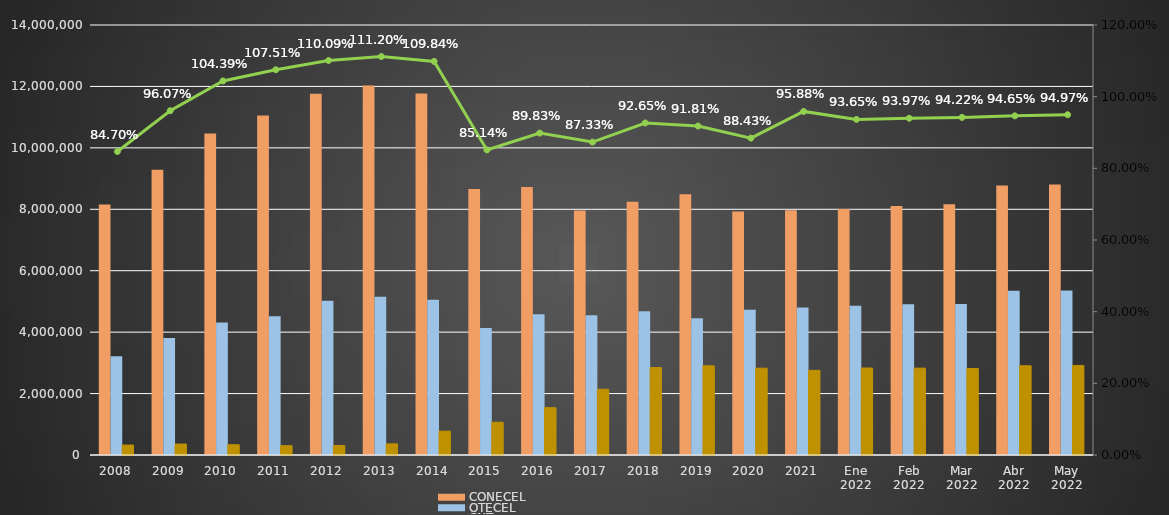
| Category | CONECEL | OTECEL | CNT |
|---|---|---|---|
| 2008 | 8156359 | 3211922 | 323967 |
| 2009 | 9291268 | 3806432 | 356900 |
| 2010 | 10470502 | 4314599 | 333730 |
| 2011 | 11057316 | 4513874 | 303368 |
| 2012 | 11757906 | 5019686 | 309271 |
| 2013 | 12030886 | 5148308 | 362560 |
| 2014 | 11772020 | 5055645 | 776892 |
| 2015 | 8658619 | 4134698 | 1065703 |
| 2016 | 8726823 | 4580092 | 1541219 |
| 2017 | 7960263 | 4549024 | 2142117 |
| 2018 | 8248050 | 4679646 | 2845142 |
| 2019 | 8493054 | 4456356 | 2903690 |
| 2020 | 7929253 | 4729725 | 2826388 |
| 2021 | 7965274 | 4800608 | 2755177 |
| Ene 2022 | 8012894 | 4856877 | 2831764 |
| Feb 2022 | 8103873 | 4909433 | 2827246 |
| Mar 2022 | 8163884 | 4915830 | 2814894 |
| Abr 2022 | 8773356 | 5349789 | 2904652 |
| May 2022 | 8810418 | 5358332 | 2916052 |